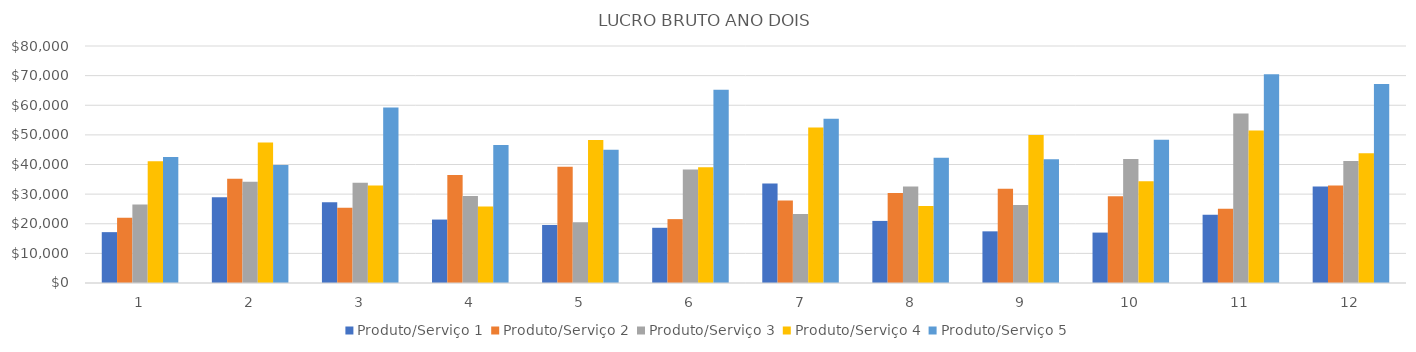
| Category | Produto/Serviço 1 | Produto/Serviço 2 | Produto/Serviço 3 | Produto/Serviço 4 | Produto/Serviço 5 |
|---|---|---|---|---|---|
| 0 | 17167.8 | 21992.6 | 26467 | 41126.4 | 42546 |
| 1 | 28975.1 | 35202.65 | 34178.4 | 47385.9 | 39830 |
| 2 | 27264 | 25397.75 | 33852 | 32945 | 59276 |
| 3 | 21413.6 | 36433.8 | 29356.6 | 25861.5 | 46578 |
| 4 | 19574.7 | 39261.6 | 20536 | 48289.5 | 45010 |
| 5 | 18637.5 | 21563.4 | 38322 | 39049.5 | 65212 |
| 6 | 33575.9 | 27828.85 | 23328 | 52448 | 55468 |
| 7 | 20959.2 | 30360 | 32580 | 26026 | 42238 |
| 8 | 17437.6 | 31848 | 26289 | 49962 | 41748 |
| 9 | 17017 | 29310.05 | 41841 | 34386 | 48356 |
| 10 | 23032.1 | 25074.75 | 57220.9 | 51454 | 70490 |
| 11 | 32578 | 32910 | 41140 | 43836 | 67192 |